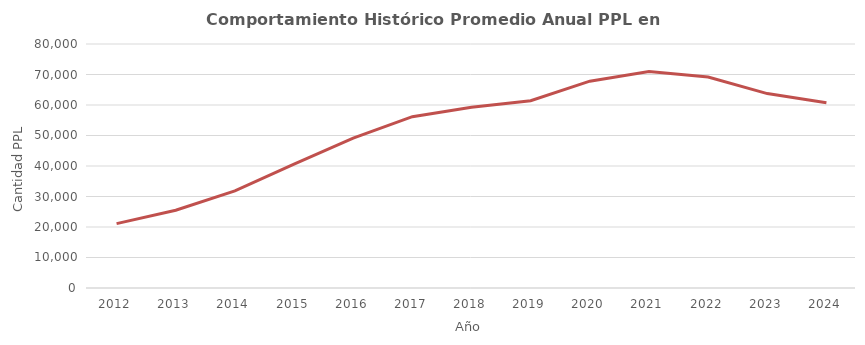
| Category | Promedio anual Domiciliaria |
|---|---|
| 2012.0 | 21098.25 |
| 2013.0 | 25499.083 |
| 2014.0 | 31836.75 |
| 2015.0 | 40614.5 |
| 2016.0 | 49161.167 |
| 2017.0 | 56180.75 |
| 2018.0 | 59289.25 |
| 2019.0 | 61380.5 |
| 2020.0 | 67811 |
| 2021.0 | 70980.5 |
| 2022.0 | 69173.833 |
| 2023.0 | 63744.25 |
| 2024.0 | 60712.5 |